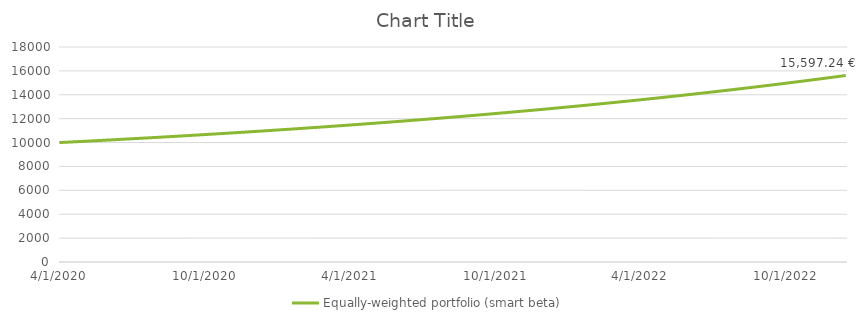
| Category | Equally-weighted portfolio (smart beta) |
|---|---|
| 4/1/20 | 10000 |
| 4/2/20 | 10003.333 |
| 4/3/20 | 10006.67 |
| 4/4/20 | 10010.01 |
| 4/5/20 | 10013.353 |
| 4/6/20 | 10016.7 |
| 4/7/20 | 10020.05 |
| 4/8/20 | 10023.403 |
| 4/9/20 | 10026.76 |
| 4/10/20 | 10030.12 |
| 4/11/20 | 10033.484 |
| 4/12/20 | 10036.851 |
| 4/13/20 | 10040.221 |
| 4/14/20 | 10043.594 |
| 4/15/20 | 10046.971 |
| 4/16/20 | 10050.352 |
| 4/17/20 | 10053.735 |
| 4/18/20 | 10057.122 |
| 4/19/20 | 10060.513 |
| 4/20/20 | 10063.907 |
| 4/21/20 | 10067.304 |
| 4/22/20 | 10070.704 |
| 4/23/20 | 10074.108 |
| 4/24/20 | 10077.516 |
| 4/25/20 | 10080.927 |
| 4/26/20 | 10084.341 |
| 4/27/20 | 10087.759 |
| 4/28/20 | 10091.18 |
| 4/29/20 | 10094.604 |
| 4/30/20 | 10098.032 |
| 5/1/20 | 10101.464 |
| 5/2/20 | 10104.898 |
| 5/3/20 | 10108.337 |
| 5/4/20 | 10111.778 |
| 5/5/20 | 10115.223 |
| 5/6/20 | 10118.672 |
| 5/7/20 | 10122.124 |
| 5/8/20 | 10125.579 |
| 5/9/20 | 10129.038 |
| 5/10/20 | 10132.501 |
| 5/11/20 | 10135.967 |
| 5/12/20 | 10139.436 |
| 5/13/20 | 10142.909 |
| 5/14/20 | 10146.385 |
| 5/15/20 | 10149.865 |
| 5/16/20 | 10153.348 |
| 5/17/20 | 10156.834 |
| 5/18/20 | 10160.325 |
| 5/19/20 | 10163.818 |
| 5/20/20 | 10167.315 |
| 5/21/20 | 10170.816 |
| 5/22/20 | 10174.32 |
| 5/23/20 | 10177.828 |
| 5/24/20 | 10181.339 |
| 5/25/20 | 10184.854 |
| 5/26/20 | 10188.372 |
| 5/27/20 | 10191.894 |
| 5/28/20 | 10195.419 |
| 5/29/20 | 10198.948 |
| 5/30/20 | 10202.48 |
| 5/31/20 | 10206.016 |
| 6/1/20 | 10209.555 |
| 6/2/20 | 10213.098 |
| 6/3/20 | 10216.644 |
| 6/4/20 | 10220.194 |
| 6/5/20 | 10223.748 |
| 6/6/20 | 10227.305 |
| 6/7/20 | 10230.866 |
| 6/8/20 | 10234.43 |
| 6/9/20 | 10237.998 |
| 6/10/20 | 10241.569 |
| 6/11/20 | 10245.144 |
| 6/12/20 | 10248.722 |
| 6/13/20 | 10252.304 |
| 6/14/20 | 10255.89 |
| 6/15/20 | 10259.479 |
| 6/16/20 | 10263.072 |
| 6/17/20 | 10266.668 |
| 6/18/20 | 10270.268 |
| 6/19/20 | 10273.872 |
| 6/20/20 | 10277.479 |
| 6/21/20 | 10281.09 |
| 6/22/20 | 10284.704 |
| 6/23/20 | 10288.322 |
| 6/24/20 | 10291.944 |
| 6/25/20 | 10295.569 |
| 6/26/20 | 10299.198 |
| 6/27/20 | 10302.831 |
| 6/28/20 | 10306.467 |
| 6/29/20 | 10310.107 |
| 6/30/20 | 10313.75 |
| 7/1/20 | 10317.397 |
| 7/2/20 | 10321.048 |
| 7/3/20 | 10324.702 |
| 7/4/20 | 10328.36 |
| 7/5/20 | 10332.022 |
| 7/6/20 | 10335.688 |
| 7/7/20 | 10339.357 |
| 7/8/20 | 10343.029 |
| 7/9/20 | 10346.706 |
| 7/10/20 | 10350.386 |
| 7/11/20 | 10354.069 |
| 7/12/20 | 10357.757 |
| 7/13/20 | 10361.448 |
| 7/14/20 | 10365.143 |
| 7/15/20 | 10368.841 |
| 7/16/20 | 10372.543 |
| 7/17/20 | 10376.249 |
| 7/18/20 | 10379.959 |
| 7/19/20 | 10383.672 |
| 7/20/20 | 10387.389 |
| 7/21/20 | 10391.11 |
| 7/22/20 | 10394.834 |
| 7/23/20 | 10398.562 |
| 7/24/20 | 10402.294 |
| 7/25/20 | 10406.03 |
| 7/26/20 | 10409.769 |
| 7/27/20 | 10413.512 |
| 7/28/20 | 10417.259 |
| 7/29/20 | 10421.01 |
| 7/30/20 | 10424.764 |
| 7/31/20 | 10428.522 |
| 8/1/20 | 10432.284 |
| 8/2/20 | 10436.05 |
| 8/3/20 | 10439.819 |
| 8/4/20 | 10443.592 |
| 8/5/20 | 10447.369 |
| 8/6/20 | 10451.15 |
| 8/7/20 | 10454.934 |
| 8/8/20 | 10458.723 |
| 8/9/20 | 10462.515 |
| 8/10/20 | 10466.311 |
| 8/11/20 | 10470.11 |
| 8/12/20 | 10473.914 |
| 8/13/20 | 10477.721 |
| 8/14/20 | 10481.532 |
| 8/15/20 | 10485.347 |
| 8/16/20 | 10489.165 |
| 8/17/20 | 10492.988 |
| 8/18/20 | 10496.814 |
| 8/19/20 | 10500.644 |
| 8/20/20 | 10504.478 |
| 8/21/20 | 10508.316 |
| 8/22/20 | 10512.158 |
| 8/23/20 | 10516.003 |
| 8/24/20 | 10519.853 |
| 8/25/20 | 10523.706 |
| 8/26/20 | 10527.563 |
| 8/27/20 | 10531.424 |
| 8/28/20 | 10535.289 |
| 8/29/20 | 10539.157 |
| 8/30/20 | 10543.03 |
| 8/31/20 | 10546.906 |
| 9/1/20 | 10550.786 |
| 9/2/20 | 10554.67 |
| 9/3/20 | 10558.558 |
| 9/4/20 | 10562.45 |
| 9/5/20 | 10566.346 |
| 9/6/20 | 10570.246 |
| 9/7/20 | 10574.149 |
| 9/8/20 | 10578.057 |
| 9/9/20 | 10581.968 |
| 9/10/20 | 10585.884 |
| 9/11/20 | 10589.803 |
| 9/12/20 | 10593.726 |
| 9/13/20 | 10597.653 |
| 9/14/20 | 10601.584 |
| 9/15/20 | 10605.519 |
| 9/16/20 | 10609.458 |
| 9/17/20 | 10613.401 |
| 9/18/20 | 10617.347 |
| 9/19/20 | 10621.298 |
| 9/20/20 | 10625.253 |
| 9/21/20 | 10629.211 |
| 9/22/20 | 10633.174 |
| 9/23/20 | 10637.14 |
| 9/24/20 | 10641.111 |
| 9/25/20 | 10645.085 |
| 9/26/20 | 10649.064 |
| 9/27/20 | 10653.046 |
| 9/28/20 | 10657.032 |
| 9/29/20 | 10661.023 |
| 9/30/20 | 10665.017 |
| 10/1/20 | 10669.015 |
| 10/2/20 | 10673.018 |
| 10/3/20 | 10677.024 |
| 10/4/20 | 10681.034 |
| 10/5/20 | 10685.049 |
| 10/6/20 | 10689.067 |
| 10/7/20 | 10693.09 |
| 10/8/20 | 10697.116 |
| 10/9/20 | 10701.146 |
| 10/10/20 | 10705.181 |
| 10/11/20 | 10709.219 |
| 10/12/20 | 10713.262 |
| 10/13/20 | 10717.309 |
| 10/14/20 | 10721.359 |
| 10/15/20 | 10725.414 |
| 10/16/20 | 10729.473 |
| 10/17/20 | 10733.535 |
| 10/18/20 | 10737.602 |
| 10/19/20 | 10741.673 |
| 10/20/20 | 10745.748 |
| 10/21/20 | 10749.827 |
| 10/22/20 | 10753.911 |
| 10/23/20 | 10757.998 |
| 10/24/20 | 10762.089 |
| 10/25/20 | 10766.185 |
| 10/26/20 | 10770.284 |
| 10/27/20 | 10774.388 |
| 10/28/20 | 10778.495 |
| 10/29/20 | 10782.607 |
| 10/30/20 | 10786.723 |
| 10/31/20 | 10790.843 |
| 11/1/20 | 10794.967 |
| 11/2/20 | 10799.096 |
| 11/3/20 | 10803.228 |
| 11/4/20 | 10807.365 |
| 11/5/20 | 10811.505 |
| 11/6/20 | 10815.65 |
| 11/7/20 | 10819.799 |
| 11/8/20 | 10823.952 |
| 11/9/20 | 10828.11 |
| 11/10/20 | 10832.271 |
| 11/11/20 | 10836.437 |
| 11/12/20 | 10840.606 |
| 11/13/20 | 10844.78 |
| 11/14/20 | 10848.958 |
| 11/15/20 | 10853.141 |
| 11/16/20 | 10857.327 |
| 11/17/20 | 10861.518 |
| 11/18/20 | 10865.713 |
| 11/19/20 | 10869.912 |
| 11/20/20 | 10874.115 |
| 11/21/20 | 10878.323 |
| 11/22/20 | 10882.534 |
| 11/23/20 | 10886.75 |
| 11/24/20 | 10890.97 |
| 11/25/20 | 10895.194 |
| 11/26/20 | 10899.423 |
| 11/27/20 | 10903.656 |
| 11/28/20 | 10907.893 |
| 11/29/20 | 10912.134 |
| 11/30/20 | 10916.379 |
| 12/1/20 | 10920.629 |
| 12/2/20 | 10924.883 |
| 12/3/20 | 10929.141 |
| 12/4/20 | 10933.404 |
| 12/5/20 | 10937.67 |
| 12/6/20 | 10941.941 |
| 12/7/20 | 10946.217 |
| 12/8/20 | 10950.496 |
| 12/9/20 | 10954.78 |
| 12/10/20 | 10959.068 |
| 12/11/20 | 10963.361 |
| 12/12/20 | 10967.657 |
| 12/13/20 | 10971.958 |
| 12/14/20 | 10976.264 |
| 12/15/20 | 10980.573 |
| 12/16/20 | 10984.887 |
| 12/17/20 | 10989.205 |
| 12/18/20 | 10993.528 |
| 12/19/20 | 10997.855 |
| 12/20/20 | 11002.186 |
| 12/21/20 | 11006.521 |
| 12/22/20 | 11010.861 |
| 12/23/20 | 11015.206 |
| 12/24/20 | 11019.554 |
| 12/25/20 | 11023.907 |
| 12/26/20 | 11028.264 |
| 12/27/20 | 11032.626 |
| 12/28/20 | 11036.992 |
| 12/29/20 | 11041.362 |
| 12/30/20 | 11045.737 |
| 12/31/20 | 11050.116 |
| 1/1/21 | 11054.499 |
| 1/2/21 | 11058.887 |
| 1/3/21 | 11063.279 |
| 1/4/21 | 11067.676 |
| 1/5/21 | 11072.077 |
| 1/6/21 | 11076.482 |
| 1/7/21 | 11080.892 |
| 1/8/21 | 11085.306 |
| 1/9/21 | 11089.725 |
| 1/10/21 | 11094.148 |
| 1/11/21 | 11098.576 |
| 1/12/21 | 11103.007 |
| 1/13/21 | 11107.444 |
| 1/14/21 | 11111.885 |
| 1/15/21 | 11116.33 |
| 1/16/21 | 11120.779 |
| 1/17/21 | 11125.234 |
| 1/18/21 | 11129.692 |
| 1/19/21 | 11134.155 |
| 1/20/21 | 11138.623 |
| 1/21/21 | 11143.095 |
| 1/22/21 | 11147.571 |
| 1/23/21 | 11152.052 |
| 1/24/21 | 11156.537 |
| 1/25/21 | 11161.027 |
| 1/26/21 | 11165.522 |
| 1/27/21 | 11170.02 |
| 1/28/21 | 11174.524 |
| 1/29/21 | 11179.032 |
| 1/30/21 | 11183.544 |
| 1/31/21 | 11188.061 |
| 2/1/21 | 11192.582 |
| 2/2/21 | 11197.108 |
| 2/3/21 | 11201.639 |
| 2/4/21 | 11206.174 |
| 2/5/21 | 11210.713 |
| 2/6/21 | 11215.257 |
| 2/7/21 | 11219.806 |
| 2/8/21 | 11224.359 |
| 2/9/21 | 11228.917 |
| 2/10/21 | 11233.479 |
| 2/11/21 | 11238.046 |
| 2/12/21 | 11242.617 |
| 2/13/21 | 11247.193 |
| 2/14/21 | 11251.774 |
| 2/15/21 | 11256.359 |
| 2/16/21 | 11260.948 |
| 2/17/21 | 11265.543 |
| 2/18/21 | 11270.141 |
| 2/19/21 | 11274.745 |
| 2/20/21 | 11279.353 |
| 2/21/21 | 11283.966 |
| 2/22/21 | 11288.583 |
| 2/23/21 | 11293.205 |
| 2/24/21 | 11297.831 |
| 2/25/21 | 11302.463 |
| 2/26/21 | 11307.098 |
| 2/27/21 | 11311.739 |
| 2/28/21 | 11316.384 |
| 3/1/21 | 11321.034 |
| 3/2/21 | 11325.688 |
| 3/3/21 | 11330.347 |
| 3/4/21 | 11335.011 |
| 3/5/21 | 11339.679 |
| 3/6/21 | 11344.352 |
| 3/7/21 | 11349.03 |
| 3/8/21 | 11353.712 |
| 3/9/21 | 11358.399 |
| 3/10/21 | 11363.091 |
| 3/11/21 | 11367.787 |
| 3/12/21 | 11372.488 |
| 3/13/21 | 11377.194 |
| 3/14/21 | 11381.905 |
| 3/15/21 | 11386.62 |
| 3/16/21 | 11391.34 |
| 3/17/21 | 11396.065 |
| 3/18/21 | 11400.794 |
| 3/19/21 | 11405.528 |
| 3/20/21 | 11410.267 |
| 3/21/21 | 11415.011 |
| 3/22/21 | 11419.759 |
| 3/23/21 | 11424.512 |
| 3/24/21 | 11429.27 |
| 3/25/21 | 11434.033 |
| 3/26/21 | 11438.8 |
| 3/27/21 | 11443.572 |
| 3/28/21 | 11448.349 |
| 3/29/21 | 11453.131 |
| 3/30/21 | 11457.917 |
| 3/31/21 | 11462.708 |
| 4/1/21 | 11467.504 |
| 4/2/21 | 11472.305 |
| 4/3/21 | 11477.111 |
| 4/4/21 | 11481.921 |
| 4/5/21 | 11486.737 |
| 4/6/21 | 11491.557 |
| 4/7/21 | 11496.382 |
| 4/8/21 | 11501.211 |
| 4/9/21 | 11506.046 |
| 4/10/21 | 11510.885 |
| 4/11/21 | 11515.729 |
| 4/12/21 | 11520.578 |
| 4/13/21 | 11525.432 |
| 4/14/21 | 11530.291 |
| 4/15/21 | 11535.155 |
| 4/16/21 | 11540.023 |
| 4/17/21 | 11544.897 |
| 4/18/21 | 11549.775 |
| 4/19/21 | 11554.658 |
| 4/20/21 | 11559.546 |
| 4/21/21 | 11564.439 |
| 4/22/21 | 11569.337 |
| 4/23/21 | 11574.239 |
| 4/24/21 | 11579.147 |
| 4/25/21 | 11584.059 |
| 4/26/21 | 11588.977 |
| 4/27/21 | 11593.899 |
| 4/28/21 | 11598.826 |
| 4/29/21 | 11603.758 |
| 4/30/21 | 11608.695 |
| 5/1/21 | 11613.637 |
| 5/2/21 | 11618.584 |
| 5/3/21 | 11623.536 |
| 5/4/21 | 11628.493 |
| 5/5/21 | 11633.455 |
| 5/6/21 | 11638.422 |
| 5/7/21 | 11643.394 |
| 5/8/21 | 11648.37 |
| 5/9/21 | 11653.352 |
| 5/10/21 | 11658.339 |
| 5/11/21 | 11663.33 |
| 5/12/21 | 11668.327 |
| 5/13/21 | 11673.329 |
| 5/14/21 | 11678.335 |
| 5/15/21 | 11683.347 |
| 5/16/21 | 11688.364 |
| 5/17/21 | 11693.385 |
| 5/18/21 | 11698.412 |
| 5/19/21 | 11703.444 |
| 5/20/21 | 11708.481 |
| 5/21/21 | 11713.523 |
| 5/22/21 | 11718.569 |
| 5/23/21 | 11723.621 |
| 5/24/21 | 11728.678 |
| 5/25/21 | 11733.74 |
| 5/26/21 | 11738.807 |
| 5/27/21 | 11743.879 |
| 5/28/21 | 11748.957 |
| 5/29/21 | 11754.039 |
| 5/30/21 | 11759.126 |
| 5/31/21 | 11764.219 |
| 6/1/21 | 11769.316 |
| 6/2/21 | 11774.419 |
| 6/3/21 | 11779.527 |
| 6/4/21 | 11784.64 |
| 6/5/21 | 11789.758 |
| 6/6/21 | 11794.881 |
| 6/7/21 | 11800.009 |
| 6/8/21 | 11805.142 |
| 6/9/21 | 11810.281 |
| 6/10/21 | 11815.424 |
| 6/11/21 | 11820.573 |
| 6/12/21 | 11825.727 |
| 6/13/21 | 11830.886 |
| 6/14/21 | 11836.05 |
| 6/15/21 | 11841.22 |
| 6/16/21 | 11846.394 |
| 6/17/21 | 11851.574 |
| 6/18/21 | 11856.759 |
| 6/19/21 | 11861.949 |
| 6/20/21 | 11867.144 |
| 6/21/21 | 11872.345 |
| 6/22/21 | 11877.55 |
| 6/23/21 | 11882.761 |
| 6/24/21 | 11887.977 |
| 6/25/21 | 11893.199 |
| 6/26/21 | 11898.425 |
| 6/27/21 | 11903.657 |
| 6/28/21 | 11908.894 |
| 6/29/21 | 11914.136 |
| 6/30/21 | 11919.384 |
| 7/1/21 | 11924.636 |
| 7/2/21 | 11929.894 |
| 7/3/21 | 11935.158 |
| 7/4/21 | 11940.426 |
| 7/5/21 | 11945.7 |
| 7/6/21 | 11950.979 |
| 7/7/21 | 11956.263 |
| 7/8/21 | 11961.553 |
| 7/9/21 | 11966.848 |
| 7/10/21 | 11972.148 |
| 7/11/21 | 11977.453 |
| 7/12/21 | 11982.764 |
| 7/13/21 | 11988.08 |
| 7/14/21 | 11993.402 |
| 7/15/21 | 11998.728 |
| 7/16/21 | 12004.06 |
| 7/17/21 | 12009.398 |
| 7/18/21 | 12014.74 |
| 7/19/21 | 12020.089 |
| 7/20/21 | 12025.442 |
| 7/21/21 | 12030.801 |
| 7/22/21 | 12036.165 |
| 7/23/21 | 12041.534 |
| 7/24/21 | 12046.909 |
| 7/25/21 | 12052.289 |
| 7/26/21 | 12057.675 |
| 7/27/21 | 12063.066 |
| 7/28/21 | 12068.463 |
| 7/29/21 | 12073.864 |
| 7/30/21 | 12079.272 |
| 7/31/21 | 12084.684 |
| 8/1/21 | 12090.102 |
| 8/2/21 | 12095.526 |
| 8/3/21 | 12100.954 |
| 8/4/21 | 12106.389 |
| 8/5/21 | 12111.828 |
| 8/6/21 | 12117.274 |
| 8/7/21 | 12122.724 |
| 8/8/21 | 12128.18 |
| 8/9/21 | 12133.642 |
| 8/10/21 | 12139.109 |
| 8/11/21 | 12144.581 |
| 8/12/21 | 12150.059 |
| 8/13/21 | 12155.543 |
| 8/14/21 | 12161.031 |
| 8/15/21 | 12166.526 |
| 8/16/21 | 12172.026 |
| 8/17/21 | 12177.531 |
| 8/18/21 | 12183.042 |
| 8/19/21 | 12188.558 |
| 8/20/21 | 12194.08 |
| 8/21/21 | 12199.608 |
| 8/22/21 | 12205.14 |
| 8/23/21 | 12210.679 |
| 8/24/21 | 12216.223 |
| 8/25/21 | 12221.772 |
| 8/26/21 | 12227.328 |
| 8/27/21 | 12232.888 |
| 8/28/21 | 12238.454 |
| 8/29/21 | 12244.026 |
| 8/30/21 | 12249.604 |
| 8/31/21 | 12255.187 |
| 9/1/21 | 12260.775 |
| 9/2/21 | 12266.369 |
| 9/3/21 | 12271.969 |
| 9/4/21 | 12277.574 |
| 9/5/21 | 12283.185 |
| 9/6/21 | 12288.802 |
| 9/7/21 | 12294.424 |
| 9/8/21 | 12300.052 |
| 9/9/21 | 12305.685 |
| 9/10/21 | 12311.324 |
| 9/11/21 | 12316.969 |
| 9/12/21 | 12322.619 |
| 9/13/21 | 12328.275 |
| 9/14/21 | 12333.936 |
| 9/15/21 | 12339.604 |
| 9/16/21 | 12345.277 |
| 9/17/21 | 12350.955 |
| 9/18/21 | 12356.64 |
| 9/19/21 | 12362.33 |
| 9/20/21 | 12368.025 |
| 9/21/21 | 12373.727 |
| 9/22/21 | 12379.434 |
| 9/23/21 | 12385.146 |
| 9/24/21 | 12390.865 |
| 9/25/21 | 12396.589 |
| 9/26/21 | 12402.319 |
| 9/27/21 | 12408.055 |
| 9/28/21 | 12413.796 |
| 9/29/21 | 12419.543 |
| 9/30/21 | 12425.296 |
| 10/1/21 | 12431.055 |
| 10/2/21 | 12436.819 |
| 10/3/21 | 12442.589 |
| 10/4/21 | 12448.365 |
| 10/5/21 | 12454.147 |
| 10/6/21 | 12459.934 |
| 10/7/21 | 12465.728 |
| 10/8/21 | 12471.527 |
| 10/9/21 | 12477.331 |
| 10/10/21 | 12483.142 |
| 10/11/21 | 12488.959 |
| 10/12/21 | 12494.781 |
| 10/13/21 | 12500.609 |
| 10/14/21 | 12506.443 |
| 10/15/21 | 12512.283 |
| 10/16/21 | 12518.128 |
| 10/17/21 | 12523.98 |
| 10/18/21 | 12529.837 |
| 10/19/21 | 12535.7 |
| 10/20/21 | 12541.569 |
| 10/21/21 | 12547.444 |
| 10/22/21 | 12553.325 |
| 10/23/21 | 12559.212 |
| 10/24/21 | 12565.104 |
| 10/25/21 | 12571.003 |
| 10/26/21 | 12576.907 |
| 10/27/21 | 12582.817 |
| 10/28/21 | 12588.733 |
| 10/29/21 | 12594.655 |
| 10/30/21 | 12600.583 |
| 10/31/21 | 12606.517 |
| 11/1/21 | 12612.457 |
| 11/2/21 | 12618.403 |
| 11/3/21 | 12624.355 |
| 11/4/21 | 12630.312 |
| 11/5/21 | 12636.276 |
| 11/6/21 | 12642.246 |
| 11/7/21 | 12648.221 |
| 11/8/21 | 12654.203 |
| 11/9/21 | 12660.19 |
| 11/10/21 | 12666.184 |
| 11/11/21 | 12672.183 |
| 11/12/21 | 12678.189 |
| 11/13/21 | 12684.2 |
| 11/14/21 | 12690.218 |
| 11/15/21 | 12696.242 |
| 11/16/21 | 12702.271 |
| 11/17/21 | 12708.307 |
| 11/18/21 | 12714.348 |
| 11/19/21 | 12720.396 |
| 11/20/21 | 12726.45 |
| 11/21/21 | 12732.51 |
| 11/22/21 | 12738.575 |
| 11/23/21 | 12744.647 |
| 11/24/21 | 12750.725 |
| 11/25/21 | 12756.809 |
| 11/26/21 | 12762.899 |
| 11/27/21 | 12768.996 |
| 11/28/21 | 12775.098 |
| 11/29/21 | 12781.206 |
| 11/30/21 | 12787.321 |
| 12/1/21 | 12793.442 |
| 12/2/21 | 12799.568 |
| 12/3/21 | 12805.701 |
| 12/4/21 | 12811.84 |
| 12/5/21 | 12817.986 |
| 12/6/21 | 12824.137 |
| 12/7/21 | 12830.294 |
| 12/8/21 | 12836.458 |
| 12/9/21 | 12842.628 |
| 12/10/21 | 12848.804 |
| 12/11/21 | 12854.986 |
| 12/12/21 | 12861.174 |
| 12/13/21 | 12867.369 |
| 12/14/21 | 12873.569 |
| 12/15/21 | 12879.776 |
| 12/16/21 | 12885.989 |
| 12/17/21 | 12892.209 |
| 12/18/21 | 12898.434 |
| 12/19/21 | 12904.666 |
| 12/20/21 | 12910.904 |
| 12/21/21 | 12917.148 |
| 12/22/21 | 12923.399 |
| 12/23/21 | 12929.655 |
| 12/24/21 | 12935.918 |
| 12/25/21 | 12942.188 |
| 12/26/21 | 12948.463 |
| 12/27/21 | 12954.745 |
| 12/28/21 | 12961.033 |
| 12/29/21 | 12967.327 |
| 12/30/21 | 12973.628 |
| 12/31/21 | 12979.935 |
| 1/1/22 | 12986.248 |
| 1/2/22 | 12992.568 |
| 1/3/22 | 12998.894 |
| 1/4/22 | 13005.226 |
| 1/5/22 | 13011.565 |
| 1/6/22 | 13017.91 |
| 1/7/22 | 13024.261 |
| 1/8/22 | 13030.618 |
| 1/9/22 | 13036.982 |
| 1/10/22 | 13043.353 |
| 1/11/22 | 13049.729 |
| 1/12/22 | 13056.112 |
| 1/13/22 | 13062.502 |
| 1/14/22 | 13068.898 |
| 1/15/22 | 13075.3 |
| 1/16/22 | 13081.709 |
| 1/17/22 | 13088.124 |
| 1/18/22 | 13094.545 |
| 1/19/22 | 13100.973 |
| 1/20/22 | 13107.407 |
| 1/21/22 | 13113.848 |
| 1/22/22 | 13120.295 |
| 1/23/22 | 13126.749 |
| 1/24/22 | 13133.209 |
| 1/25/22 | 13139.675 |
| 1/26/22 | 13146.148 |
| 1/27/22 | 13152.628 |
| 1/28/22 | 13159.114 |
| 1/29/22 | 13165.606 |
| 1/30/22 | 13172.105 |
| 1/31/22 | 13178.611 |
| 2/1/22 | 13185.123 |
| 2/2/22 | 13191.641 |
| 2/3/22 | 13198.166 |
| 2/4/22 | 13204.698 |
| 2/5/22 | 13211.236 |
| 2/6/22 | 13217.78 |
| 2/7/22 | 13224.331 |
| 2/8/22 | 13230.889 |
| 2/9/22 | 13237.453 |
| 2/10/22 | 13244.024 |
| 2/11/22 | 13250.601 |
| 2/12/22 | 13257.185 |
| 2/13/22 | 13263.776 |
| 2/14/22 | 13270.373 |
| 2/15/22 | 13276.977 |
| 2/16/22 | 13283.587 |
| 2/17/22 | 13290.204 |
| 2/18/22 | 13296.827 |
| 2/19/22 | 13303.457 |
| 2/20/22 | 13310.094 |
| 2/21/22 | 13316.738 |
| 2/22/22 | 13323.388 |
| 2/23/22 | 13330.044 |
| 2/24/22 | 13336.708 |
| 2/25/22 | 13343.378 |
| 2/26/22 | 13350.055 |
| 2/27/22 | 13356.738 |
| 2/28/22 | 13363.428 |
| 3/1/22 | 13370.125 |
| 3/2/22 | 13376.828 |
| 3/3/22 | 13383.538 |
| 3/4/22 | 13390.255 |
| 3/5/22 | 13396.979 |
| 3/6/22 | 13403.709 |
| 3/7/22 | 13410.446 |
| 3/8/22 | 13417.19 |
| 3/9/22 | 13423.941 |
| 3/10/22 | 13430.698 |
| 3/11/22 | 13437.462 |
| 3/12/22 | 13444.233 |
| 3/13/22 | 13451.01 |
| 3/14/22 | 13457.795 |
| 3/15/22 | 13464.586 |
| 3/16/22 | 13471.384 |
| 3/17/22 | 13478.188 |
| 3/18/22 | 13485 |
| 3/19/22 | 13491.818 |
| 3/20/22 | 13498.643 |
| 3/21/22 | 13505.475 |
| 3/22/22 | 13512.314 |
| 3/23/22 | 13519.16 |
| 3/24/22 | 13526.012 |
| 3/25/22 | 13532.872 |
| 3/26/22 | 13539.738 |
| 3/27/22 | 13546.611 |
| 3/28/22 | 13553.491 |
| 3/29/22 | 13560.378 |
| 3/30/22 | 13567.271 |
| 3/31/22 | 13574.172 |
| 4/1/22 | 13581.079 |
| 4/2/22 | 13587.994 |
| 4/3/22 | 13594.915 |
| 4/4/22 | 13601.843 |
| 4/5/22 | 13608.779 |
| 4/6/22 | 13615.721 |
| 4/7/22 | 13622.67 |
| 4/8/22 | 13629.626 |
| 4/9/22 | 13636.589 |
| 4/10/22 | 13643.559 |
| 4/11/22 | 13650.536 |
| 4/12/22 | 13657.519 |
| 4/13/22 | 13664.51 |
| 4/14/22 | 13671.508 |
| 4/15/22 | 13678.513 |
| 4/16/22 | 13685.525 |
| 4/17/22 | 13692.544 |
| 4/18/22 | 13699.57 |
| 4/19/22 | 13706.602 |
| 4/20/22 | 13713.642 |
| 4/21/22 | 13720.689 |
| 4/22/22 | 13727.743 |
| 4/23/22 | 13734.804 |
| 4/24/22 | 13741.873 |
| 4/25/22 | 13748.948 |
| 4/26/22 | 13756.03 |
| 4/27/22 | 13763.119 |
| 4/28/22 | 13770.216 |
| 4/29/22 | 13777.319 |
| 4/30/22 | 13784.43 |
| 5/1/22 | 13791.548 |
| 5/2/22 | 13798.673 |
| 5/3/22 | 13805.805 |
| 5/4/22 | 13812.944 |
| 5/5/22 | 13820.09 |
| 5/6/22 | 13827.244 |
| 5/7/22 | 13834.404 |
| 5/8/22 | 13841.572 |
| 5/9/22 | 13848.747 |
| 5/10/22 | 13855.929 |
| 5/11/22 | 13863.118 |
| 5/12/22 | 13870.315 |
| 5/13/22 | 13877.518 |
| 5/14/22 | 13884.729 |
| 5/15/22 | 13891.947 |
| 5/16/22 | 13899.172 |
| 5/17/22 | 13906.405 |
| 5/18/22 | 13913.645 |
| 5/19/22 | 13920.892 |
| 5/20/22 | 13928.146 |
| 5/21/22 | 13935.407 |
| 5/22/22 | 13942.676 |
| 5/23/22 | 13949.952 |
| 5/24/22 | 13957.235 |
| 5/25/22 | 13964.526 |
| 5/26/22 | 13971.824 |
| 5/27/22 | 13979.129 |
| 5/28/22 | 13986.441 |
| 5/29/22 | 13993.761 |
| 5/30/22 | 14001.088 |
| 5/31/22 | 14008.423 |
| 6/1/22 | 14015.765 |
| 6/2/22 | 14023.114 |
| 6/3/22 | 14030.47 |
| 6/4/22 | 14037.834 |
| 6/5/22 | 14045.205 |
| 6/6/22 | 14052.584 |
| 6/7/22 | 14059.97 |
| 6/8/22 | 14067.363 |
| 6/9/22 | 14074.764 |
| 6/10/22 | 14082.172 |
| 6/11/22 | 14089.587 |
| 6/12/22 | 14097.01 |
| 6/13/22 | 14104.44 |
| 6/14/22 | 14111.878 |
| 6/15/22 | 14119.323 |
| 6/16/22 | 14126.776 |
| 6/17/22 | 14134.236 |
| 6/18/22 | 14141.704 |
| 6/19/22 | 14149.179 |
| 6/20/22 | 14156.661 |
| 6/21/22 | 14164.151 |
| 6/22/22 | 14171.649 |
| 6/23/22 | 14179.154 |
| 6/24/22 | 14186.666 |
| 6/25/22 | 14194.186 |
| 6/26/22 | 14201.714 |
| 6/27/22 | 14209.249 |
| 6/28/22 | 14216.791 |
| 6/29/22 | 14224.341 |
| 6/30/22 | 14231.899 |
| 7/1/22 | 14239.464 |
| 7/2/22 | 14247.037 |
| 7/3/22 | 14254.618 |
| 7/4/22 | 14262.205 |
| 7/5/22 | 14269.801 |
| 7/6/22 | 14277.404 |
| 7/7/22 | 14285.015 |
| 7/8/22 | 14292.633 |
| 7/9/22 | 14300.259 |
| 7/10/22 | 14307.893 |
| 7/11/22 | 14315.534 |
| 7/12/22 | 14323.183 |
| 7/13/22 | 14330.839 |
| 7/14/22 | 14338.504 |
| 7/15/22 | 14346.175 |
| 7/16/22 | 14353.855 |
| 7/17/22 | 14361.542 |
| 7/18/22 | 14369.237 |
| 7/19/22 | 14376.94 |
| 7/20/22 | 14384.65 |
| 7/21/22 | 14392.368 |
| 7/22/22 | 14400.094 |
| 7/23/22 | 14407.827 |
| 7/24/22 | 14415.568 |
| 7/25/22 | 14423.317 |
| 7/26/22 | 14431.074 |
| 7/27/22 | 14438.838 |
| 7/28/22 | 14446.61 |
| 7/29/22 | 14454.39 |
| 7/30/22 | 14462.178 |
| 7/31/22 | 14469.973 |
| 8/1/22 | 14477.777 |
| 8/2/22 | 14485.588 |
| 8/3/22 | 14493.407 |
| 8/4/22 | 14501.234 |
| 8/5/22 | 14509.068 |
| 8/6/22 | 14516.91 |
| 8/7/22 | 14524.761 |
| 8/8/22 | 14532.619 |
| 8/9/22 | 14540.485 |
| 8/10/22 | 14548.359 |
| 8/11/22 | 14556.24 |
| 8/12/22 | 14564.13 |
| 8/13/22 | 14572.027 |
| 8/14/22 | 14579.933 |
| 8/15/22 | 14587.846 |
| 8/16/22 | 14595.767 |
| 8/17/22 | 14603.696 |
| 8/18/22 | 14611.633 |
| 8/19/22 | 14619.578 |
| 8/20/22 | 14627.531 |
| 8/21/22 | 14635.492 |
| 8/22/22 | 14643.461 |
| 8/23/22 | 14651.438 |
| 8/24/22 | 14659.422 |
| 8/25/22 | 14667.415 |
| 8/26/22 | 14675.416 |
| 8/27/22 | 14683.425 |
| 8/28/22 | 14691.441 |
| 8/29/22 | 14699.466 |
| 8/30/22 | 14707.499 |
| 8/31/22 | 14715.54 |
| 9/1/22 | 14723.589 |
| 9/2/22 | 14731.646 |
| 9/3/22 | 14739.711 |
| 9/4/22 | 14747.784 |
| 9/5/22 | 14755.865 |
| 9/6/22 | 14763.954 |
| 9/7/22 | 14772.051 |
| 9/8/22 | 14780.157 |
| 9/9/22 | 14788.27 |
| 9/10/22 | 14796.392 |
| 9/11/22 | 14804.521 |
| 9/12/22 | 14812.659 |
| 9/13/22 | 14820.805 |
| 9/14/22 | 14828.959 |
| 9/15/22 | 14837.122 |
| 9/16/22 | 14845.292 |
| 9/17/22 | 14853.471 |
| 9/18/22 | 14861.658 |
| 9/19/22 | 14869.853 |
| 9/20/22 | 14878.056 |
| 9/21/22 | 14886.267 |
| 9/22/22 | 14894.487 |
| 9/23/22 | 14902.715 |
| 9/24/22 | 14910.951 |
| 9/25/22 | 14919.195 |
| 9/26/22 | 14927.447 |
| 9/27/22 | 14935.708 |
| 9/28/22 | 14943.977 |
| 9/29/22 | 14952.255 |
| 9/30/22 | 14960.54 |
| 10/1/22 | 14968.834 |
| 10/2/22 | 14977.136 |
| 10/3/22 | 14985.447 |
| 10/4/22 | 14993.765 |
| 10/5/22 | 15002.093 |
| 10/6/22 | 15010.428 |
| 10/7/22 | 15018.772 |
| 10/8/22 | 15027.124 |
| 10/9/22 | 15035.484 |
| 10/10/22 | 15043.853 |
| 10/11/22 | 15052.23 |
| 10/12/22 | 15060.616 |
| 10/13/22 | 15069.01 |
| 10/14/22 | 15077.412 |
| 10/15/22 | 15085.823 |
| 10/16/22 | 15094.242 |
| 10/17/22 | 15102.67 |
| 10/18/22 | 15111.106 |
| 10/19/22 | 15119.55 |
| 10/20/22 | 15128.003 |
| 10/21/22 | 15136.464 |
| 10/22/22 | 15144.934 |
| 10/23/22 | 15153.412 |
| 10/24/22 | 15161.899 |
| 10/25/22 | 15170.394 |
| 10/26/22 | 15178.898 |
| 10/27/22 | 15187.41 |
| 10/28/22 | 15195.931 |
| 10/29/22 | 15204.46 |
| 10/30/22 | 15212.998 |
| 10/31/22 | 15221.544 |
| 11/1/22 | 15230.099 |
| 11/2/22 | 15238.663 |
| 11/3/22 | 15247.235 |
| 11/4/22 | 15255.815 |
| 11/5/22 | 15264.404 |
| 11/6/22 | 15273.002 |
| 11/7/22 | 15281.609 |
| 11/8/22 | 15290.223 |
| 11/9/22 | 15298.847 |
| 11/10/22 | 15307.479 |
| 11/11/22 | 15316.12 |
| 11/12/22 | 15324.769 |
| 11/13/22 | 15333.428 |
| 11/14/22 | 15342.094 |
| 11/15/22 | 15350.77 |
| 11/16/22 | 15359.454 |
| 11/17/22 | 15368.147 |
| 11/18/22 | 15376.848 |
| 11/19/22 | 15385.558 |
| 11/20/22 | 15394.277 |
| 11/21/22 | 15403.005 |
| 11/22/22 | 15411.741 |
| 11/23/22 | 15420.486 |
| 11/24/22 | 15429.24 |
| 11/25/22 | 15438.003 |
| 11/26/22 | 15446.774 |
| 11/27/22 | 15455.554 |
| 11/28/22 | 15464.343 |
| 11/29/22 | 15473.141 |
| 11/30/22 | 15481.947 |
| 12/1/22 | 15490.762 |
| 12/2/22 | 15499.586 |
| 12/3/22 | 15508.419 |
| 12/4/22 | 15517.261 |
| 12/5/22 | 15526.112 |
| 12/6/22 | 15534.971 |
| 12/7/22 | 15543.839 |
| 12/8/22 | 15552.717 |
| 12/9/22 | 15561.603 |
| 12/10/22 | 15570.498 |
| 12/11/22 | 15579.401 |
| 12/12/22 | 15588.314 |
| 12/13/22 | 15597.236 |
| 12/14/22 | 15606.166 |
| 12/15/22 | 15615.106 |
| 12/16/22 | 15624.054 |